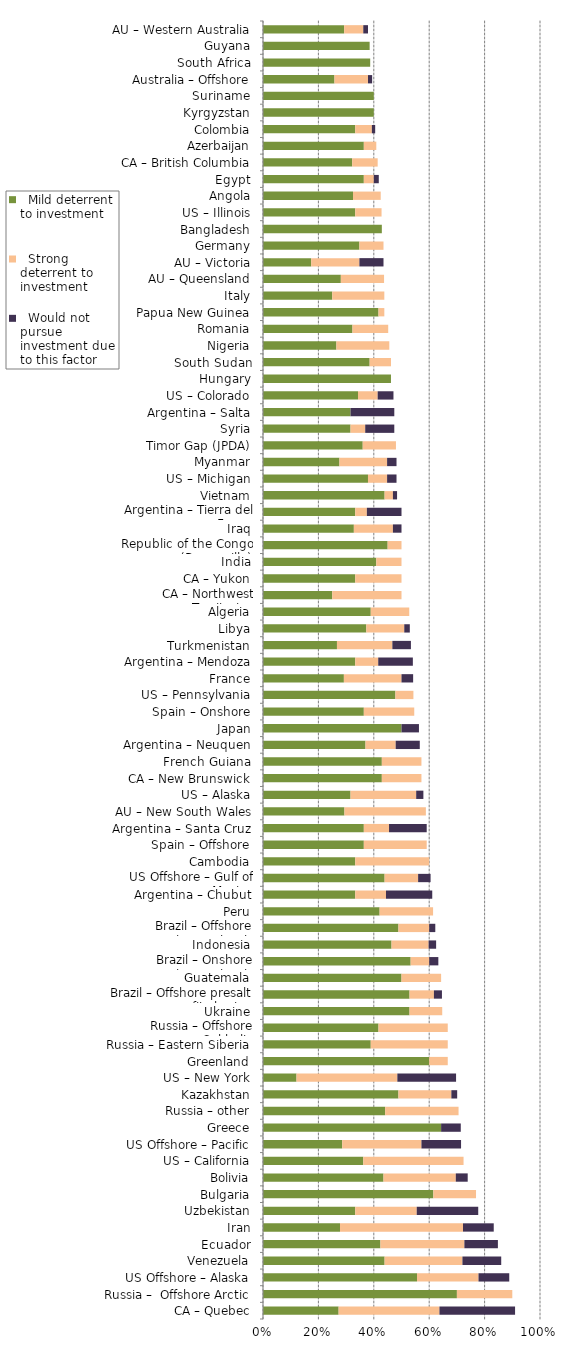
| Category |   Mild deterrent to investment |   Strong deterrent to investment |   Would not pursue investment due to this factor |
|---|---|---|---|
| CA – Quebec | 0.273 | 0.364 | 0.273 |
| Russia –  Offshore Arctic | 0.7 | 0.2 | 0 |
| US Offshore – Alaska | 0.556 | 0.222 | 0.111 |
| Venezuela | 0.439 | 0.281 | 0.14 |
| Ecuador | 0.424 | 0.303 | 0.121 |
| Iran | 0.278 | 0.444 | 0.111 |
| Uzbekistan | 0.333 | 0.222 | 0.222 |
| Bulgaria | 0.615 | 0.154 | 0 |
| Bolivia | 0.435 | 0.261 | 0.043 |
| US – California | 0.362 | 0.362 | 0 |
| US Offshore – Pacific | 0.286 | 0.286 | 0.143 |
| Greece | 0.643 | 0 | 0.071 |
| Russia – other | 0.441 | 0.265 | 0 |
| Kazakhstan | 0.489 | 0.191 | 0.021 |
| US – New York | 0.121 | 0.364 | 0.212 |
| Greenland | 0.6 | 0.067 | 0 |
| Russia – Eastern Siberia | 0.389 | 0.278 | 0 |
| Russia – Offshore Sakhalin | 0.417 | 0.25 | 0 |
| Ukraine | 0.529 | 0.118 | 0 |
| Brazil – Offshore presalt area profit sharing contracts | 0.529 | 0.088 | 0.029 |
| Guatemala | 0.5 | 0.143 | 0 |
| Brazil – Onshore concession contracts | 0.533 | 0.067 | 0.033 |
| Indonesia | 0.464 | 0.134 | 0.027 |
| Brazil – Offshore concession contracts | 0.489 | 0.111 | 0.022 |
| Peru | 0.421 | 0.193 | 0 |
| Argentina – Chubut | 0.333 | 0.111 | 0.167 |
| US Offshore – Gulf of Mexico | 0.439 | 0.121 | 0.045 |
| Cambodia | 0.333 | 0.267 | 0 |
| Spain – Offshore | 0.364 | 0.227 | 0 |
| Argentina – Santa Cruz | 0.364 | 0.091 | 0.136 |
| AU – New South Wales | 0.294 | 0.294 | 0 |
| US – Alaska | 0.316 | 0.237 | 0.026 |
| CA – New Brunswick | 0.429 | 0.143 | 0 |
| French Guiana | 0.429 | 0.143 | 0 |
| Argentina – Neuquen | 0.37 | 0.109 | 0.087 |
| Japan | 0.5 | 0 | 0.063 |
| Spain – Onshore | 0.364 | 0.182 | 0 |
| US – Pennsylvania | 0.478 | 0.065 | 0 |
| France | 0.292 | 0.208 | 0.042 |
| Argentina – Mendoza | 0.333 | 0.083 | 0.125 |
| Turkmenistan | 0.267 | 0.2 | 0.067 |
| Libya | 0.373 | 0.137 | 0.02 |
| Algeria | 0.389 | 0.139 | 0 |
| CA – Northwest Territories | 0.25 | 0.25 | 0 |
| CA – Yukon | 0.333 | 0.167 | 0 |
| India | 0.409 | 0.091 | 0 |
| Republic of the Congo (Brazzaville) | 0.45 | 0.05 | 0 |
| Iraq | 0.328 | 0.141 | 0.031 |
| Argentina – Tierra del Fuego | 0.333 | 0.042 | 0.125 |
| Vietnam | 0.439 | 0.03 | 0.015 |
| US – Michigan | 0.379 | 0.069 | 0.034 |
| Myanmar | 0.276 | 0.172 | 0.034 |
| Timor Gap (JPDA) | 0.36 | 0.12 | 0 |
| Syria | 0.316 | 0.053 | 0.105 |
| Argentina – Salta | 0.316 | 0 | 0.158 |
| US – Colorado | 0.343 | 0.071 | 0.057 |
| Hungary | 0.462 | 0 | 0 |
| South Sudan | 0.385 | 0.077 | 0 |
| Nigeria | 0.265 | 0.191 | 0 |
| Romania | 0.323 | 0.129 | 0 |
| Papua New Guinea | 0.417 | 0.021 | 0 |
| Italy | 0.25 | 0.188 | 0 |
| AU – Queensland | 0.281 | 0.156 | 0 |
| AU – Victoria | 0.174 | 0.174 | 0.087 |
| Germany | 0.348 | 0.087 | 0 |
| Bangladesh | 0.429 | 0 | 0 |
| US – Illinois | 0.333 | 0.095 | 0 |
| Angola | 0.325 | 0.1 | 0 |
| Egypt | 0.364 | 0.036 | 0.018 |
| CA – British Columbia | 0.322 | 0.092 | 0 |
| Azerbaijan | 0.364 | 0.045 | 0 |
| Colombia | 0.333 | 0.06 | 0.012 |
| Kyrgyzstan | 0.4 | 0 | 0 |
| Suriname | 0.4 | 0 | 0 |
| Australia – Offshore | 0.258 | 0.121 | 0.015 |
| South Africa | 0.387 | 0 | 0 |
| Guyana | 0.385 | 0 | 0 |
| AU – Western Australia | 0.293 | 0.069 | 0.017 |